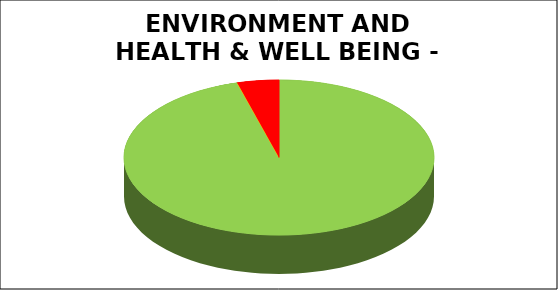
| Category | Series 0 |
|---|---|
| Green | 0.957 |
| Amber | 0 |
| Red | 0.043 |